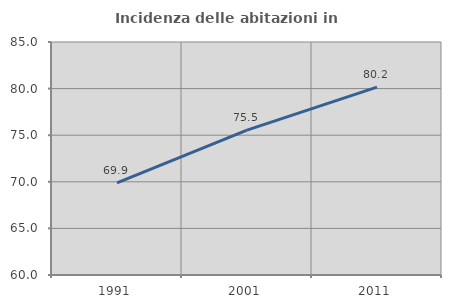
| Category | Incidenza delle abitazioni in proprietà  |
|---|---|
| 1991.0 | 69.886 |
| 2001.0 | 75.546 |
| 2011.0 | 80.159 |